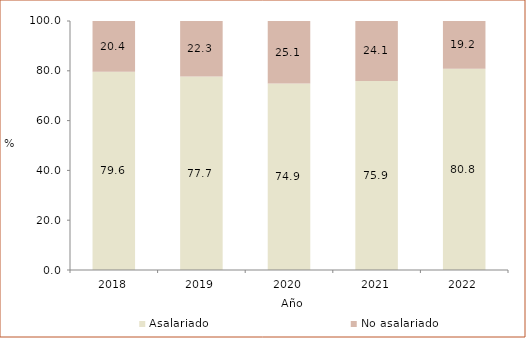
| Category | Asalariado | No asalariado |
|---|---|---|
| 2018.0 | 79.59 | 20.41 |
| 2019.0 | 77.702 | 22.298 |
| 2020.0 | 74.92 | 25.08 |
| 2021.0 | 75.917 | 24.083 |
| 2022.0 | 80.8 | 19.2 |